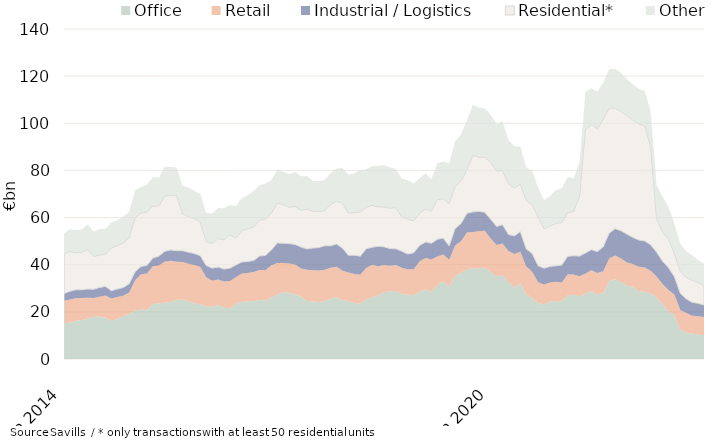
| Category | Office | Retail | Industrial / Logistics | Residential* | Other |
|---|---|---|---|---|---|
| 2014-06-01 | 15124322325.66 | 9544432647.24 | 3105506584.98 | 16600111315.18 | 8991377388.38 |
| 2014-07-01 | 15448732963.88 | 9841966235.24 | 3440852401.98 | 16949735532.68 | 9378736034.61 |
| 2014-08-01 | 16202650242.88 | 9605725785.24 | 3573059549.98 | 15649735374.68 | 9567173270.13 |
| 2014-09-01 | 16540559929.08 | 9322562926.84 | 3506391505.5 | 16011360713.68 | 9578863130.17 |
| 2014-10-01 | 17171487968.08 | 8835595600.84 | 3656699955.5 | 16676134819.88 | 10730952073.17 |
| 2014-11-01 | 17813374968.08 | 8086156198.05 | 3665328905.5 | 13926949559.89 | 10567862157.2 |
| 2014-12-01 | 18060975690.74 | 8359038033.03 | 3920968980.31 | 13718641413.41 | 11132525795.81 |
| 2015-01-01 | 17459892204.74 | 9435012663.03 | 3883908572.31 | 13694885050.41 | 10813390235.82 |
| 2015-02-01 | 16253490231.74 | 9372549053.81 | 3308490268.73 | 18198536996.91 | 10732409376.05 |
| 2015-03-01 | 17014558031.53 | 9334060176.81 | 3368654245.73 | 18305200941.91 | 10836415091.98 |
| 2015-04-01 | 18243172783.53 | 8600759739.81 | 3468694360.68 | 18878550268.91 | 11177168923.98 |
| 2015-05-01 | 19228290474.45 | 8936850539.31 | 3728635607.68 | 19450093150.91 | 11222836416.98 |
| 2015-06-01 | 20613024085.83 | 12804218553.14 | 3559231021.83 | 23020549786.51 | 11567758082.75 |
| 2015-07-01 | 21096337533.5 | 14814698989.21 | 3371725415.86 | 22588207592.35 | 11136948094.21 |
| 2015-08-01 | 20672725633.5 | 15562941505.21 | 3450767146.86 | 22635118357.35 | 11619805261.21 |
| 2015-09-01 | 23300473453.46 | 16001092585.73 | 3520511283.36 | 22065141963.35 | 12272234886.21 |
| 2015-10-01 | 23499972857.46 | 16181040556.36 | 3919085482.36 | 21292965650.35 | 11980577367.21 |
| 2015-11-01 | 23955623619.14 | 17339041737.5 | 4397719316.13 | 23395398176.29 | 12436639283.38 |
| 2015-12-01 | 24202213697.48 | 17455198961.04 | 4557113724.92 | 23319336016.77 | 11968978194.75 |
| 2016-01-01 | 25139700628.48 | 16138997225.45 | 4662502872.92 | 23277671921.77 | 12028959045.24 |
| 2016-02-01 | 25294714349.53 | 15820090497.99 | 4833139363.87 | 15563498654.77 | 12008953720.01 |
| 2016-03-01 | 24534844202.74 | 15865699828.72 | 4877967507.07 | 15108592339.77 | 12318880326.08 |
| 2016-04-01 | 23667928105.74 | 16254770286.07 | 4833846127.82 | 14760671477.37 | 11756957541.08 |
| 2016-05-01 | 23258991507.82 | 15809944380.07 | 4749671116.82 | 14232081715.37 | 11979556735.04 |
| 2016-06-01 | 22424129844.36 | 12232494883.06 | 4999570420.67 | 10189436595.87 | 12067576140.06 |
| 2016-07-01 | 22113990925.69 | 11125435985.56 | 5312245465.64 | 10404072475.53 | 12817090834.96 |
| 2016-08-01 | 23020503074.69 | 10746738868.56 | 5247332254.55 | 12050427222.53 | 12859367434.96 |
| 2016-09-01 | 21721152253.73 | 11146501725.47 | 5270185116.55 | 12465620399.13 | 13401325786.26 |
| 2016-10-01 | 21376679446.86 | 11740308168.84 | 5398267322.55 | 14070034790.02 | 12750064856.83 |
| 2016-11-01 | 23418913086.76 | 11239816740.7 | 5243284144.73 | 11380146617.09 | 13519628479.66 |
| 2016-12-01 | 24311240228.4 | 11942470429.99 | 4890351002.13 | 13331201908.09 | 13795642420.64 |
| 2017-01-01 | 24509608793.4 | 11953863686.96 | 4924744810.37 | 13729696509.09 | 14374441491.58 |
| 2017-02-01 | 24522929822.41 | 12378572437.09 | 4842785725 | 14267858145.09 | 15334823384.58 |
| 2017-03-01 | 24979801711.4 | 12787832178.37 | 5899654543.8 | 15167920484.39 | 14896863125.58 |
| 2017-04-01 | 24819990861.71 | 12853010576.9 | 6262060580.1 | 15489114794.79 | 15001124286.67 |
| 2017-05-01 | 26232596283.47 | 13514985630.15 | 6483702097.1 | 15522287182.8 | 14232593390.28 |
| 2017-06-01 | 27213166704.1 | 13474043478.5 | 8562546401.46 | 16801850396.39 | 14405141008.56 |
| 2017-07-01 | 28420051498.1 | 12322239347.93 | 8324132158.46 | 16480355706.39 | 13885696506.2 |
| 2017-08-01 | 28135534177.1 | 12429029136.93 | 8386695707.55 | 15442529308.39 | 13975101051.2 |
| 2017-09-01 | 27443892685.45 | 12637830917.94 | 8510058041.55 | 16123359085.78 | 14623727852.74 |
| 2017-10-01 | 26496035870.32 | 11930960273.94 | 9048046430.46 | 15580068614.87 | 14489647455.17 |
| 2017-11-01 | 24563217292.17 | 13335421843.83 | 8802947546.51 | 16947694524.87 | 13987097251.44 |
| 2017-12-01 | 24418717997.53 | 13186078236.48 | 9470343512.7 | 15610704960.87 | 12870505660.48 |
| 2018-01-01 | 24147632440.53 | 13385637745.1 | 9721702683.46 | 15307451168.86 | 12960925425.04 |
| 2018-02-01 | 24510655677.47 | 13346974130.65 | 10213193365.46 | 14917009796.86 | 12986586521.04 |
| 2018-03-01 | 25667146433.48 | 13025014136.64 | 9307934893.46 | 17524767231.49 | 13418976929.02 |
| 2018-04-01 | 26099570226.17 | 13083782210.76 | 9605919650.46 | 18204136136.49 | 13808159540.93 |
| 2018-05-01 | 25037149940.41 | 12454100846.51 | 9488564046.46 | 19015064846.48 | 14983964806.36 |
| 2018-06-01 | 24480115752.78 | 12171900363.34 | 7330050155.1 | 17955943579.56 | 16176104694.08 |
| 2018-07-01 | 23746042590.78 | 12322300226.32 | 7966869588.1 | 18082211683.56 | 16667307498.19 |
| 2018-08-01 | 23488045994.76 | 12247139005.19 | 7892000709.1 | 18779877058.41 | 17798374873.04 |
| 2018-09-01 | 25319157455.41 | 13289291079.55 | 8129841438.1 | 17594307591.42 | 16165594775.21 |
| 2018-10-01 | 26231931201.41 | 13760202882.82 | 7406435586.25 | 17806279798.32 | 16705006538.21 |
| 2018-11-01 | 26888009103.45 | 12507346034.88 | 8394898728.54 | 16739676352.32 | 17423267492.25 |
| 2018-12-01 | 28411133671.45 | 11512722354.68 | 7666795490.35 | 16935559846.32 | 17648510774.26 |
| 2019-01-01 | 28624375832.45 | 10984616615.68 | 7214323719.35 | 17121877027.2 | 17262129869.26 |
| 2019-02-01 | 28937833501.45 | 10992187442.4 | 6831262259.96 | 17475124974.2 | 16505959059.62 |
| 2019-03-01 | 27544432810.45 | 11171202657.26 | 6985219187.16 | 14435875855.27 | 16375726447.64 |
| 2019-04-01 | 27372510768.31 | 10721779269.12 | 6436402186.06 | 14851488460.14 | 16413562534.89 |
| 2019-05-01 | 27086917264.31 | 11007377577.12 | 6927571752.06 | 13578486873.14 | 15893173230.89 |
| 2019-06-01 | 28619867307.82 | 12738169920.09 | 6809920057.06 | 13614047047.47 | 14867133741.96 |
| 2019-07-01 | 29482720307.29 | 13385300761.26 | 6728675032.06 | 13997066612.47 | 15072784896.92 |
| 2019-08-01 | 28588886723.31 | 13638029313.39 | 6860393893.06 | 13732511102.62 | 13431643208.07 |
| 2019-09-01 | 31431933528.25 | 12091023494.97 | 7256389082.92 | 16840249545.62 | 15541758025.83 |
| 2019-10-01 | 32996773890.25 | 11371608887.7 | 6895687562.55 | 16682300148.74 | 15838199476.83 |
| 2019-11-01 | 30747832297.78 | 11335647756.75 | 5893842897.79 | 18031124443.74 | 16887332442.52 |
| 2019-12-01 | 35334005929.49 | 12781157931.88 | 7226755920.45 | 17715667348.74 | 19265302136.48 |
| 2020-01-01 | 36516820661.49 | 13487927499.88 | 7453722361.23 | 18152920102.87 | 19615098754.48 |
| 2020-02-01 | 38084737725.44 | 15551306208.37 | 8154238247.38 | 18359461221.37 | 21204647892.2 |
| 2020-03-01 | 38536531931.89 | 15394481027.15 | 8471027173.18 | 24045743487.37 | 21373673299.78 |
| 2020-04-01 | 38256530051.03 | 15909355259.17 | 8455055344.28 | 22903801936.5 | 21029666350.53 |
| 2020-05-01 | 38867138687.03 | 15549925373.17 | 7866152944.28 | 23331791777.5 | 20708204226.49 |
| 2020-06-01 | 36849446438.52 | 14238996200.21 | 8181133859.28 | 24099048462.5 | 20329960819.42 |
| 2020-07-01 | 35086325856.05 | 13278324936.06 | 7897445112.28 | 23512544941.5 | 19816230669.72 |
| 2020-08-01 | 35652184893.05 | 13399418372.06 | 7904030159.28 | 23019438157.5 | 20937406001.21 |
| 2020-09-01 | 32533510165.11 | 13286221072.68 | 6993537103.42 | 21488103702.49 | 18616523037.08 |
| 2020-10-01 | 30353161894.11 | 14210244651.68 | 7653043535.73 | 20371879725.49 | 17652695454.54 |
| 2020-11-01 | 32247955846.11 | 13301015524.68 | 8501168007.2 | 20089398385.49 | 15966830074.98 |
| 2020-12-01 | 27599930161.4 | 11648902878.74 | 7446392351.54 | 20512288435.49 | 14141512434.88 |
| 2021-01-01 | 25921759544.4 | 11069358524.74 | 7780780077.76 | 20716309315.49 | 14218941361.79 |
| 2021-02-01 | 23908737126.45 | 8600024692.53 | 7042733081 | 20712784697.99 | 12574535049.47 |
| 2021-03-01 | 23101513208 | 8516775234.89 | 6893563504.99 | 16648692848.99 | 12339264276.25 |
| 2021-04-01 | 24368493390 | 8122958283.01 | 6772887225.99 | 17196667013.99 | 12555198051.25 |
| 2021-05-01 | 24479537158 | 8250741268.01 | 6792007486.99 | 17960984016.99 | 14194327505.29 |
| 2021-06-01 | 24482801015 | 7926850715 | 7434856566.99 | 18020040212.99 | 14606745804.91 |
| 2021-07-01 | 27014997780 | 8896560964 | 7654402804.99 | 18579669487.74 | 15097423206.54 |
| 2021-08-01 | 27299574255 | 8538094889 | 7941811530.96 | 18695239563.74 | 14067257119.05 |
| 2021-09-01 | 26501922518 | 8634833538.91 | 8513470029.96 | 25423180018.75 | 14496232198.41 |
| 2021-10-01 | 27904435965.69 | 8345126149.91 | 8718556719.96 | 52394288139.75 | 15938516542.32 |
| 2021-11-01 | 28798148963.69 | 8863008325.91 | 8723527233.96 | 53009740980.75 | 15416920184.88 |
| 2021-12-01 | 27415313872.69 | 9050736644.86 | 9077587684.96 | 52199054488.25 | 15791867630.98 |
| 2022-01-01 | 27949757110.69 | 9275364704.07 | 10383777571.97 | 53988429725.25 | 15692520614.07 |
| 2022-02-01 | 33125689958.24 | 9551708048.13 | 10704097643.97 | 53077405582.79 | 16562689403.17 |
| 2022-03-01 | 33857515395.27 | 10040082923.43 | 11389710614.93 | 51149380016.79 | 16599834574.48 |
| 2022-04-01 | 32650229595.27 | 9943557958.43 | 11812991651.93 | 50546256384.79 | 16529994879.48 |
| 2022-05-01 | 31110923747.27 | 9876926537.43 | 11975183780.93 | 50312904424.79 | 15392705100.48 |
| 2022-06-01 | 30629394788.74 | 9653126858.42 | 11290613589.93 | 49749625507.79 | 15179515749.32 |
| 2022-07-01 | 28707658351.74 | 10393769165.8 | 11344232658.93 | 49274252009.04 | 14823926934.32 |
| 2022-08-01 | 28653380028.74 | 10182891400.8 | 11237678843.96 | 48753674000.02 | 14876040458.32 |
| 2022-09-01 | 27813688953.74 | 9628730190.89 | 10989634907.96 | 41190392038.17 | 15519378526.27 |
| 2022-10-01 | 26094737992.05 | 8899042365.89 | 10325027063.96 | 14112032562.17 | 14393764882.88 |
| 2022-11-01 | 23335989930.49 | 8435826910.89 | 9685569462.96 | 12300953008.17 | 15297659520.8 |
| 2022-12-01 | 20118172432.49 | 9134739347.94 | 9489575299.94 | 12116768458.67 | 13645925845.84 |
| 2023-01-01 | 18687904045.49 | 8705390745.73 | 7544980009.93 | 9623549565.65 | 12870979976.84 |
| 2023-02-01 | 12393224769.94 | 8370080295.67 | 7105848808.93 | 9259453360.11 | 11782703822.98 |
| 2023-03-01 | 11236590333.91 | 8296028149.37 | 6007744734.98 | 9035971229.11 | 11139351102.31 |
| 2023-04-01 | 10663870958.91 | 7679951985.37 | 5662179737.98 | 9367035511.53 | 10594363331.31 |
| 2023-05-01 | 10552771357.91 | 7565046625.37 | 5500110677.98 | 8878440517.53 | 9553756340.31 |
| 2023-06-01 | 10061781860.44 | 7800014932.37 | 5058463160.98 | 7972252588.53 | 9465106095.85 |